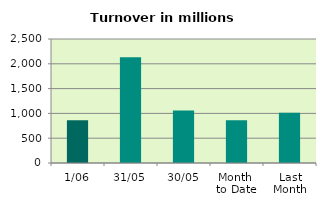
| Category | Series 0 |
|---|---|
| 1/06 | 863.328 |
| 31/05 | 2133.193 |
| 30/05 | 1056.284 |
| Month 
to Date | 863.328 |
| Last
Month | 1012.592 |